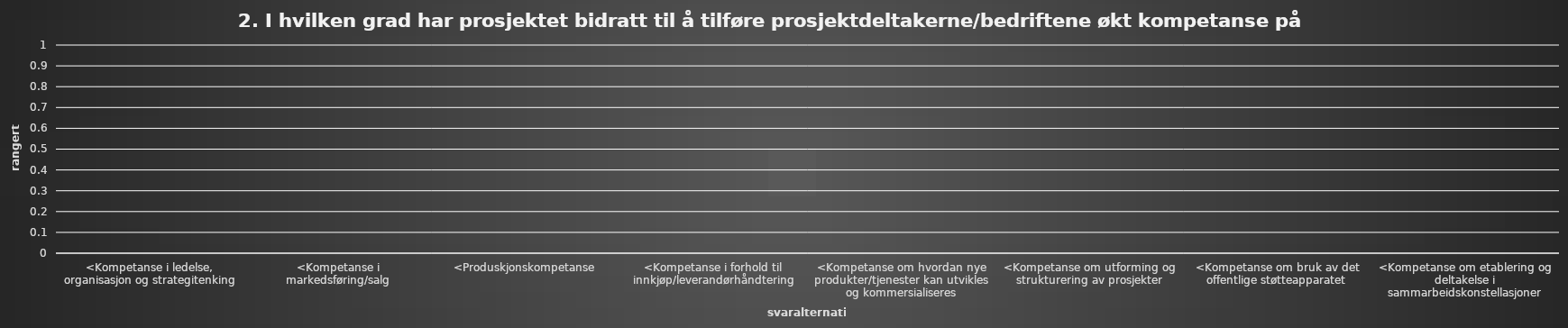
| Category | Series 0 |
|---|---|
| <Kompetanse i ledelse, organisasjon og strategitenking | 0 |
| <Kompetanse i markedsføring/salg | 0 |
| <Produskjonskompetanse | 0 |
| <Kompetanse i forhold til innkjøp/leverandørhåndtering | 0 |
| <Kompetanse om hvordan nye produkter/tjenester kan utvikles og kommersialiseres | 0 |
| <Kompetanse om utforming og strukturering av prosjekter | 0 |
| <Kompetanse om bruk av det offentlige støtteapparatet | 0 |
| <Kompetanse om etablering og deltakelse i sammarbeidskonstellasjoner | 0 |